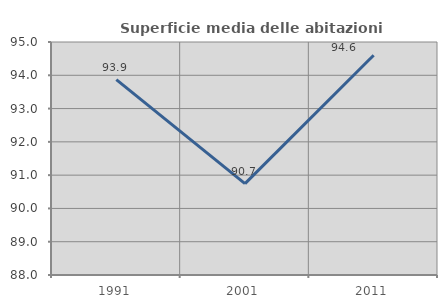
| Category | Superficie media delle abitazioni occupate |
|---|---|
| 1991.0 | 93.872 |
| 2001.0 | 90.747 |
| 2011.0 | 94.601 |